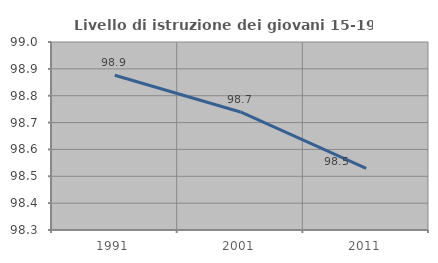
| Category | Livello di istruzione dei giovani 15-19 anni |
|---|---|
| 1991.0 | 98.876 |
| 2001.0 | 98.739 |
| 2011.0 | 98.529 |